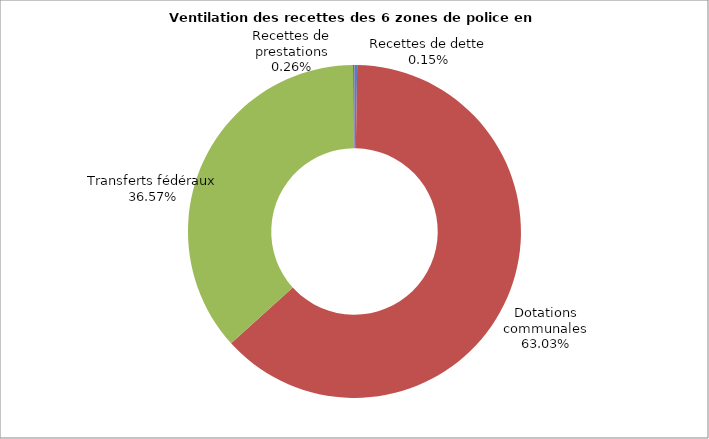
| Category | Series 0 |
|---|---|
| Recettes de prestations | 0.003 |
| Dotations communales | 0.63 |
| Transferts fédéraux | 0.366 |
| Recettes de dette | 0.001 |